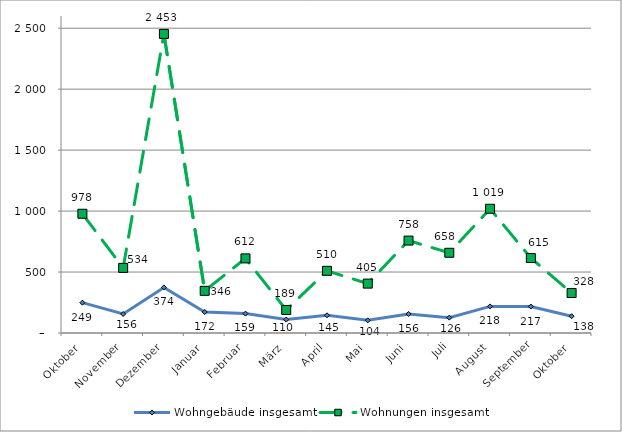
| Category | Wohngebäude insgesamt | Wohnungen insgesamt |
|---|---|---|
| Oktober | 249 | 978 |
| November | 156 | 534 |
| Dezember | 374 | 2453 |
| Januar | 172 | 346 |
| Februar | 159 | 612 |
| März | 110 | 189 |
| April | 145 | 510 |
| Mai | 104 | 405 |
| Juni | 156 | 758 |
| Juli | 126 | 658 |
| August | 218 | 1019 |
| September | 217 | 615 |
| Oktober | 138 | 328 |